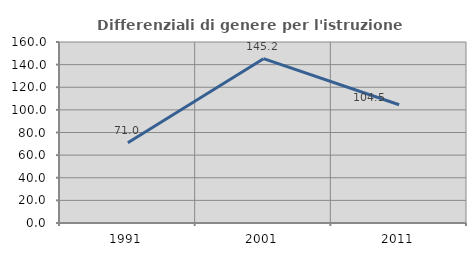
| Category | Differenziali di genere per l'istruzione superiore |
|---|---|
| 1991.0 | 70.964 |
| 2001.0 | 145.249 |
| 2011.0 | 104.5 |